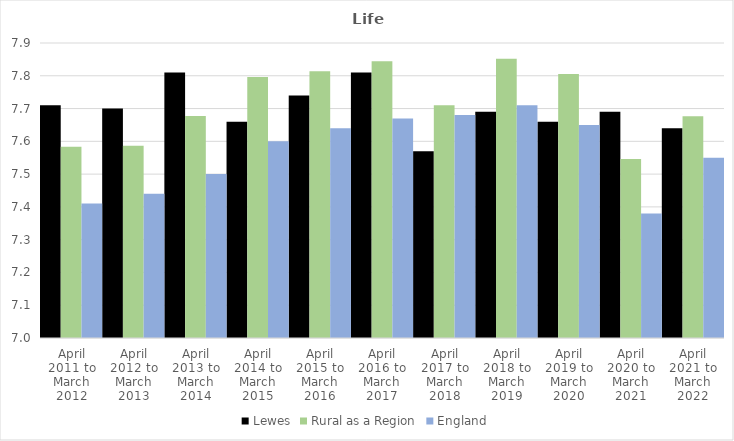
| Category | Lewes | Rural as a Region | England |
|---|---|---|---|
| April 2011 to March 2012 | 7.71 | 7.584 | 7.41 |
| April 2012 to March 2013 | 7.7 | 7.586 | 7.44 |
| April 2013 to March 2014 | 7.81 | 7.677 | 7.5 |
| April 2014 to March 2015 | 7.66 | 7.797 | 7.6 |
| April 2015 to March 2016 | 7.74 | 7.813 | 7.64 |
| April 2016 to March 2017 | 7.81 | 7.845 | 7.67 |
| April 2017 to March 2018 | 7.57 | 7.71 | 7.68 |
| April 2018 to March 2019 | 7.69 | 7.852 | 7.71 |
| April 2019 to March 2020 | 7.66 | 7.806 | 7.65 |
| April 2020 to March 2021 | 7.69 | 7.546 | 7.38 |
| April 2021 to March 2022 | 7.64 | 7.677 | 7.55 |